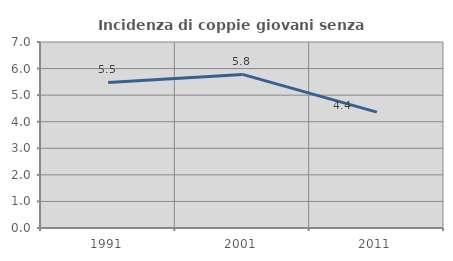
| Category | Incidenza di coppie giovani senza figli |
|---|---|
| 1991.0 | 5.479 |
| 2001.0 | 5.78 |
| 2011.0 | 4.36 |